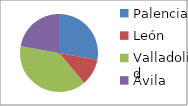
| Category | Series 0 |
|---|---|
| Palencia | 5 |
| León | 2 |
| Valladolid | 7 |
| Ávila | 4 |